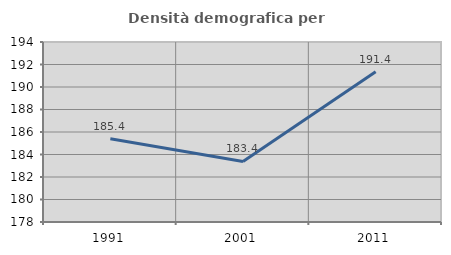
| Category | Densità demografica |
|---|---|
| 1991.0 | 185.391 |
| 2001.0 | 183.381 |
| 2011.0 | 191.364 |